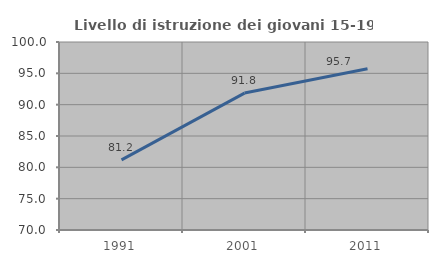
| Category | Livello di istruzione dei giovani 15-19 anni |
|---|---|
| 1991.0 | 81.189 |
| 2001.0 | 91.847 |
| 2011.0 | 95.723 |